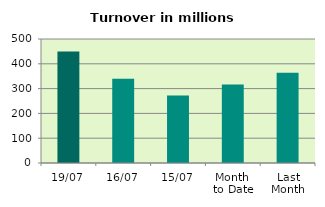
| Category | Series 0 |
|---|---|
| 19/07 | 450.031 |
| 16/07 | 339.348 |
| 15/07 | 271.78 |
| Month 
to Date | 316.128 |
| Last
Month | 364.182 |